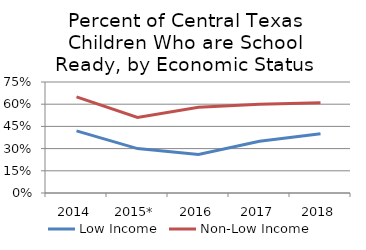
| Category | Low Income | Non-Low Income |
|---|---|---|
| 2014 | 0.42 | 0.65 |
| 2015* | 0.3 | 0.51 |
| 2016 | 0.26 | 0.58 |
| 2017 | 0.35 | 0.6 |
| 2018 | 0.4 | 0.61 |